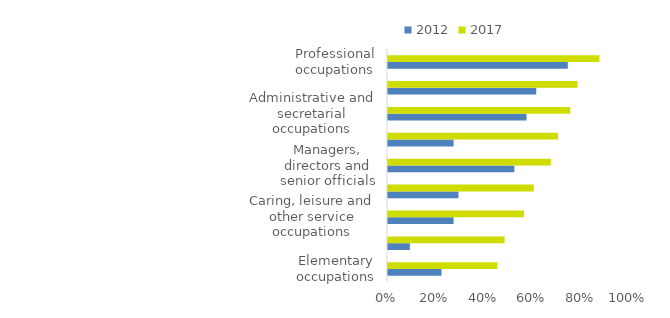
| Category | 2012 | 2017 |
|---|---|---|
| Elementary occupations | 0.22 | 0.45 |
| Sales and customer service occupations | 0.09 | 0.48 |
| Caring, leisure and other service occupations | 0.27 | 0.56 |
| Skilled trades occupations | 0.29 | 0.6 |
| Managers, directors and senior officials | 0.52 | 0.67 |
| Process, plant and machine operatives | 0.27 | 0.7 |
| Administrative and secretarial occupations | 0.57 | 0.75 |
| Associate professional and technical occupations | 0.61 | 0.78 |
| Professional occupations | 0.74 | 0.87 |